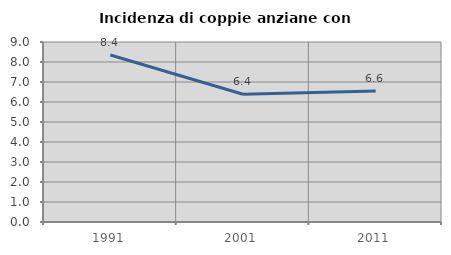
| Category | Incidenza di coppie anziane con figli |
|---|---|
| 1991.0 | 8.35 |
| 2001.0 | 6.387 |
| 2011.0 | 6.55 |